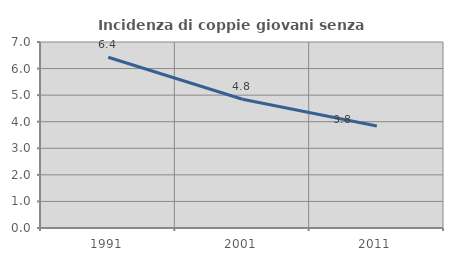
| Category | Incidenza di coppie giovani senza figli |
|---|---|
| 1991.0 | 6.425 |
| 2001.0 | 4.847 |
| 2011.0 | 3.838 |